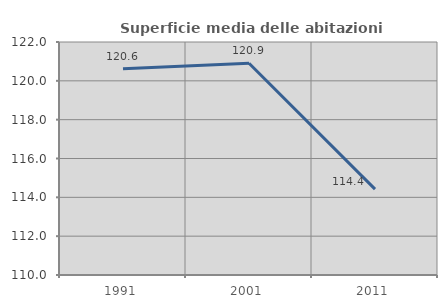
| Category | Superficie media delle abitazioni occupate |
|---|---|
| 1991.0 | 120.621 |
| 2001.0 | 120.903 |
| 2011.0 | 114.421 |